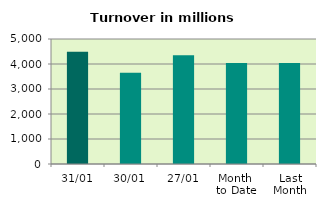
| Category | Series 0 |
|---|---|
| 31/01 | 4490.672 |
| 30/01 | 3650.717 |
| 27/01 | 4351.735 |
| Month 
to Date | 4043.095 |
| Last
Month | 4039.067 |